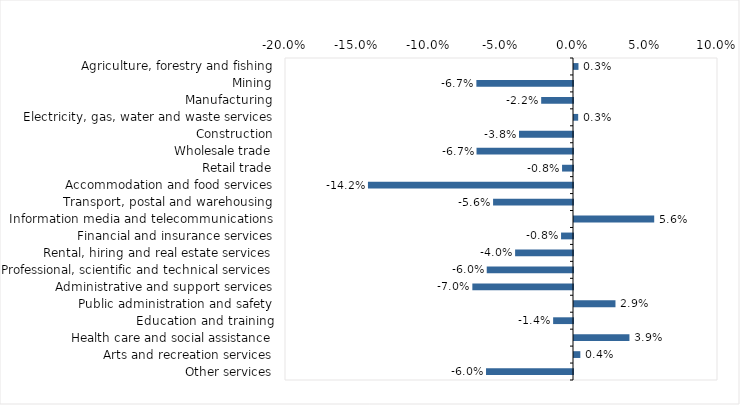
| Category | This week |
|---|---|
| Agriculture, forestry and fishing | 0.003 |
| Mining | -0.067 |
| Manufacturing | -0.022 |
| Electricity, gas, water and waste services | 0.003 |
| Construction | -0.038 |
| Wholesale trade | -0.067 |
| Retail trade | -0.008 |
| Accommodation and food services | -0.142 |
| Transport, postal and warehousing | -0.056 |
| Information media and telecommunications | 0.056 |
| Financial and insurance services | -0.008 |
| Rental, hiring and real estate services | -0.04 |
| Professional, scientific and technical services | -0.06 |
| Administrative and support services | -0.07 |
| Public administration and safety | 0.029 |
| Education and training | -0.014 |
| Health care and social assistance | 0.038 |
| Arts and recreation services | 0.004 |
| Other services | -0.06 |